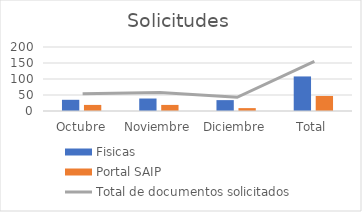
| Category | Fisicas | Portal SAIP |
|---|---|---|
| Octubre | 35 | 19 |
| Noviembre | 39 | 19 |
| Diciembre | 34 | 9 |
| Total | 108 | 47 |